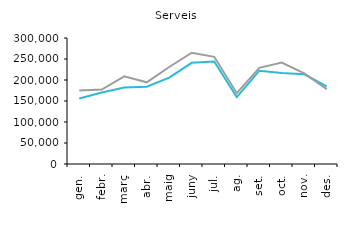
| Category | 2016 | 2017 |
|---|---|---|
| gen. | 156098 | 174730 |
| febr. | 170426 | 177163 |
| març | 182292 | 208621 |
| abr. | 183833 | 194425 |
| maig | 205570 | 231009 |
| juny | 240938 | 265037 |
| jul. | 243935 | 255205 |
| ag. | 159353 | 168610 |
| set. | 221886 | 229027 |
| oct. | 216462 | 241629 |
| nov. | 213453 | 215642 |
| des. | 184670 | 178201 |